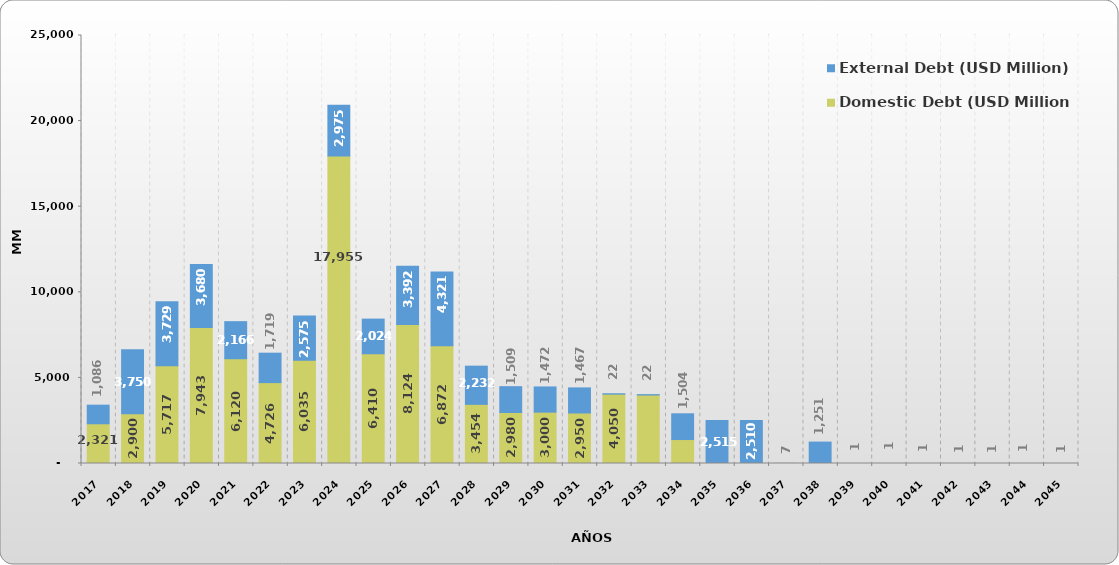
| Category | Domestic Debt (USD Million) | External Debt (USD Million) |
|---|---|---|
| 2017.0 | 2321.248 | 1086.162 |
| 2018.0 | 2900.371 | 3750.161 |
| 2019.0 | 5716.796 | 3729.345 |
| 2020.0 | 7943.045 | 3679.989 |
| 2021.0 | 6119.69 | 2165.802 |
| 2022.0 | 4725.892 | 1718.715 |
| 2023.0 | 6034.526 | 2574.731 |
| 2024.0 | 17954.526 | 2975.39 |
| 2025.0 | 6410.189 | 2023.895 |
| 2026.0 | 8123.655 | 3391.741 |
| 2027.0 | 6872.248 | 4320.545 |
| 2028.0 | 3453.742 | 2231.816 |
| 2029.0 | 2980 | 1508.543 |
| 2030.0 | 3000 | 1471.835 |
| 2031.0 | 2950 | 1466.753 |
| 2032.0 | 4050 | 22.411 |
| 2033.0 | 4000 | 22.045 |
| 2034.0 | 1400 | 1504.201 |
| 2035.0 | 0 | 2515.201 |
| 2036.0 | 0 | 2510.132 |
| 2037.0 | 0 | 6.681 |
| 2038.0 | 0 | 1250.711 |
| 2039.0 | 0 | 0.708 |
| 2040.0 | 0 | 0.708 |
| 2041.0 | 0 | 0.708 |
| 2042.0 | 0 | 0.708 |
| 2043.0 | 0 | 0.708 |
| 2044.0 | 0 | 0.708 |
| 2045.0 | 0 | 0.708 |